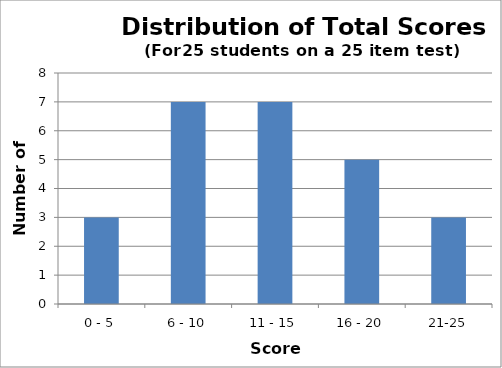
| Category | Scores |
|---|---|
| 0 - 5 | 3 |
| 6 - 10 | 7 |
| 11 - 15 | 7 |
| 16 - 20 | 5 |
| 21-25 | 3 |